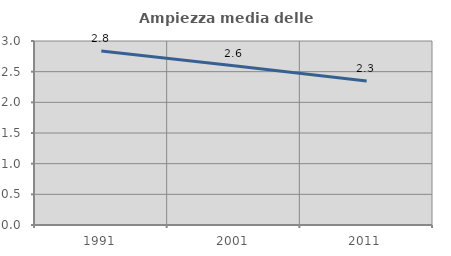
| Category | Ampiezza media delle famiglie |
|---|---|
| 1991.0 | 2.837 |
| 2001.0 | 2.596 |
| 2011.0 | 2.348 |